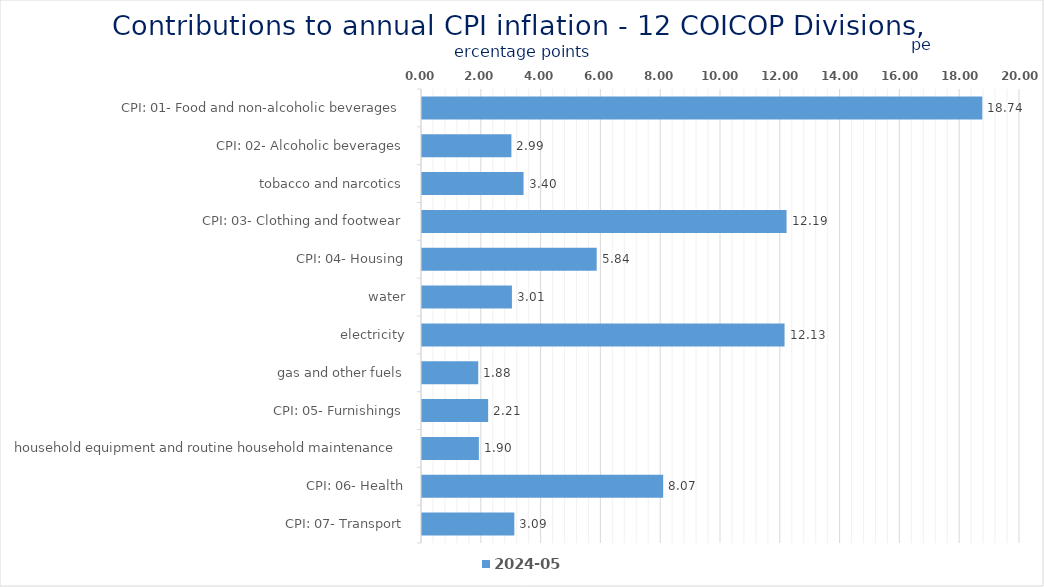
| Category | 2024-05 |
|---|---|
| CPI: 01- Food and non-alcoholic beverages | 18.739 |
| CPI: 02- Alcoholic beverages, tobacco and narcotics | 2.99 |
| CPI: 03- Clothing and footwear | 3.396 |
| CPI: 04- Housing, water, electricity, gas and other fuels | 12.193 |
| CPI: 05- Furnishings, household equipment and routine household maintenance | 5.843 |
| CPI: 06- Health | 3.008 |
| CPI: 07- Transport | 12.126 |
| CPI: 08- Communication | 1.882 |
| CPI: 09- Recreation and culture | 2.212 |
| CPI: 10- Education | 1.903 |
| CPI: 11- Restaurants and hotels | 8.066 |
| CPI: 12- Miscellaneous goods and services | 3.088 |